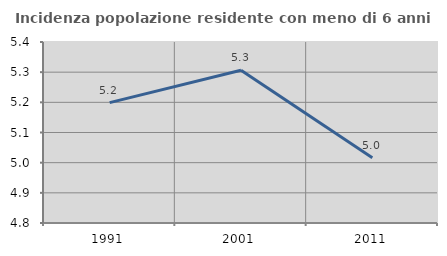
| Category | Incidenza popolazione residente con meno di 6 anni |
|---|---|
| 1991.0 | 5.199 |
| 2001.0 | 5.306 |
| 2011.0 | 5.016 |